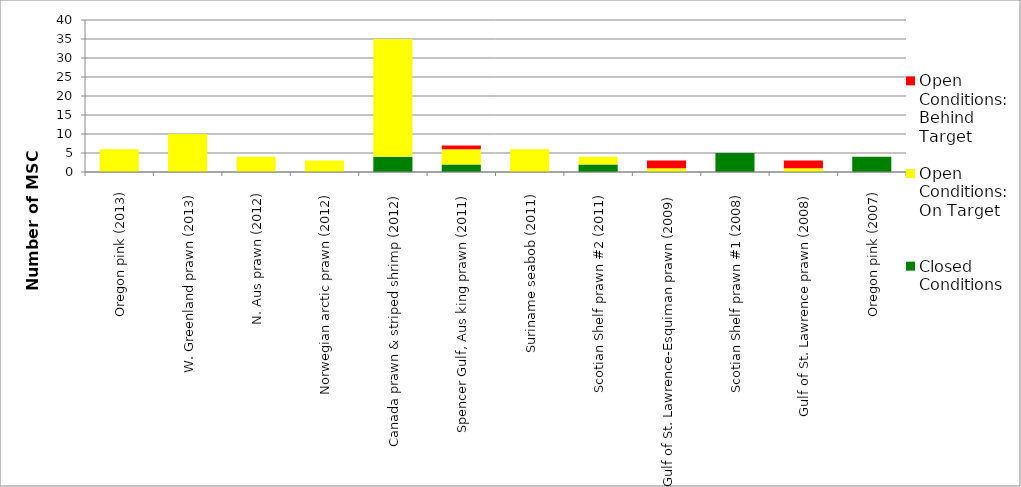
| Category | Closed Conditions | Open Conditions: On Target | Open Conditions: Behind Target |
|---|---|---|---|
| Oregon pink (2013) | 0 | 6 | 0 |
| W. Greenland prawn (2013) | 0 | 10 | 0 |
| N. Aus prawn (2012) | 0 | 4 | 0 |
| Norwegian arctic prawn (2012) | 0 | 3 | 0 |
| Canada prawn & striped shrimp (2012) | 4 | 31 | 0 |
| Spencer Gulf, Aus king prawn (2011) | 2 | 4 | 1 |
| Suriname seabob (2011) | 0 | 6 | 0 |
| Scotian Shelf prawn #2 (2011) | 2 | 2 | 0 |
| Gulf of St. Lawrence-Esquiman prawn (2009) | 0 | 1 | 2 |
| Scotian Shelf prawn #1 (2008) | 5 | 0 | 0 |
| Gulf of St. Lawrence prawn (2008) | 0 | 1 | 2 |
| Oregon pink (2007) | 4 | 0 | 0 |